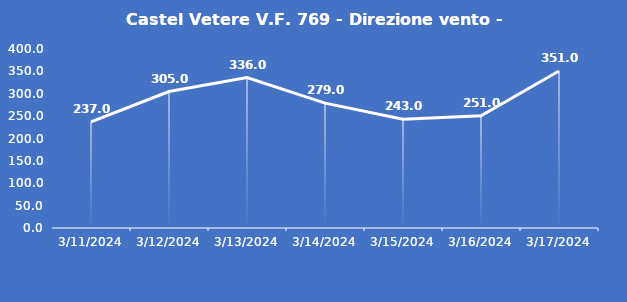
| Category | Castel Vetere V.F. 769 - Direzione vento - Grezzo (°N) |
|---|---|
| 3/11/24 | 237 |
| 3/12/24 | 305 |
| 3/13/24 | 336 |
| 3/14/24 | 279 |
| 3/15/24 | 243 |
| 3/16/24 | 251 |
| 3/17/24 | 351 |